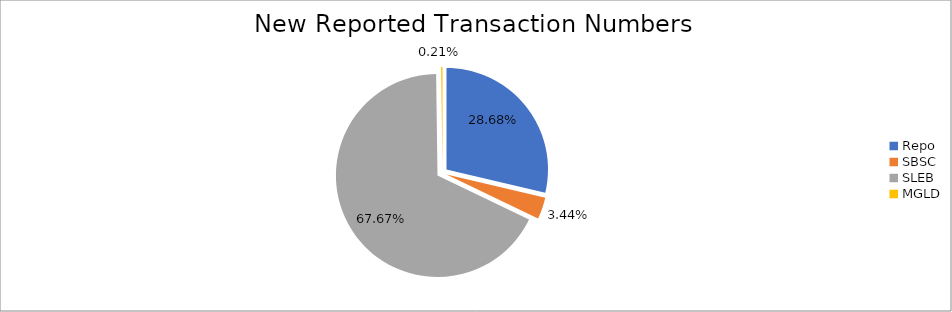
| Category | Series 0 |
|---|---|
| Repo | 374542 |
| SBSC | 44887 |
| SLEB | 883694 |
| MGLD | 2806 |